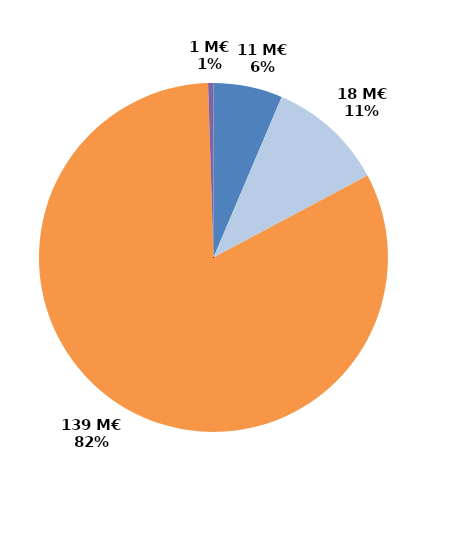
| Category | Series 0 |
|---|---|
| CIF - CPF | 10.825 |
| Période de professionnalisation | 18.344 |
| Plan de formation | 139.355 |
| Autres | 0.841 |